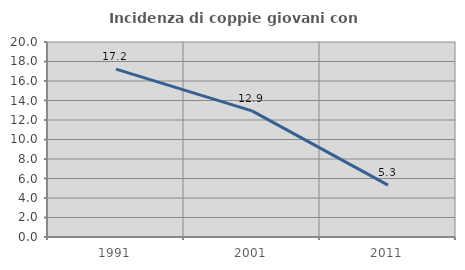
| Category | Incidenza di coppie giovani con figli |
|---|---|
| 1991.0 | 17.222 |
| 2001.0 | 12.941 |
| 2011.0 | 5.321 |